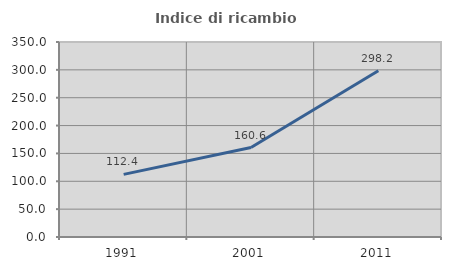
| Category | Indice di ricambio occupazionale  |
|---|---|
| 1991.0 | 112.426 |
| 2001.0 | 160.602 |
| 2011.0 | 298.239 |